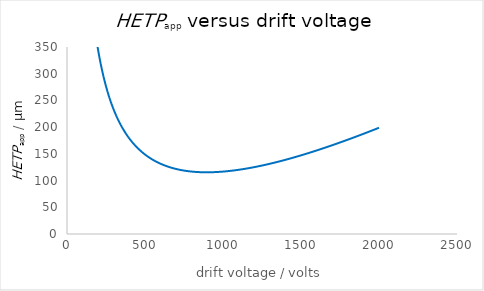
| Category | Series 0 |
|---|---|
| 1.0 | 61631.686 |
| 2.0 | 31091.12 |
| 3.0 | 20854.214 |
| 4.0 | 15715.368 |
| 5.0 | 12622.148 |
| 6.0 | 10554.353 |
| 7.0 | 9073.799 |
| 8.0 | 7960.981 |
| 9.0 | 7093.749 |
| 10.0 | 6398.702 |
| 11.0 | 5829.066 |
| 12.0 | 5353.618 |
| 13.0 | 4950.715 |
| 14.0 | 4604.882 |
| 15.0 | 4304.758 |
| 16.0 | 4041.814 |
| 17.0 | 3809.52 |
| 18.0 | 3602.794 |
| 19.0 | 3417.62 |
| 20.0 | 3250.782 |
| 21.0 | 3099.675 |
| 22.0 | 2962.166 |
| 23.0 | 2836.49 |
| 24.0 | 2721.178 |
| 25.0 | 2614.992 |
| 26.0 | 2516.886 |
| 27.0 | 2425.968 |
| 28.0 | 2341.472 |
| 29.0 | 2262.738 |
| 30.0 | 2189.193 |
| 31.0 | 2120.339 |
| 32.0 | 2055.738 |
| 33.0 | 1995.006 |
| 34.0 | 1937.804 |
| 35.0 | 1883.832 |
| 36.0 | 1832.823 |
| 37.0 | 1784.537 |
| 38.0 | 1738.761 |
| 39.0 | 1695.303 |
| 40.0 | 1653.991 |
| 41.0 | 1614.669 |
| 42.0 | 1577.196 |
| 43.0 | 1541.444 |
| 44.0 | 1507.296 |
| 45.0 | 1474.645 |
| 46.0 | 1443.396 |
| 47.0 | 1413.46 |
| 48.0 | 1384.754 |
| 49.0 | 1357.204 |
| 50.0 | 1330.742 |
| 51.0 | 1305.304 |
| 52.0 | 1280.83 |
| 53.0 | 1257.268 |
| 54.0 | 1234.567 |
| 55.0 | 1212.68 |
| 56.0 | 1191.564 |
| 57.0 | 1171.178 |
| 58.0 | 1151.486 |
| 59.0 | 1132.452 |
| 60.0 | 1114.044 |
| 61.0 | 1096.231 |
| 62.0 | 1078.984 |
| 63.0 | 1062.278 |
| 64.0 | 1046.086 |
| 65.0 | 1030.385 |
| 66.0 | 1015.153 |
| 67.0 | 1000.37 |
| 68.0 | 986.015 |
| 69.0 | 972.07 |
| 70.0 | 958.518 |
| 71.0 | 945.342 |
| 72.0 | 932.527 |
| 73.0 | 920.058 |
| 74.0 | 907.922 |
| 75.0 | 896.104 |
| 76.0 | 884.593 |
| 77.0 | 873.376 |
| 78.0 | 862.443 |
| 79.0 | 851.783 |
| 80.0 | 841.385 |
| 81.0 | 831.24 |
| 82.0 | 821.34 |
| 83.0 | 811.674 |
| 84.0 | 802.235 |
| 85.0 | 793.015 |
| 86.0 | 784.007 |
| 87.0 | 775.202 |
| 88.0 | 766.595 |
| 89.0 | 758.178 |
| 90.0 | 749.946 |
| 91.0 | 741.892 |
| 92.0 | 734.01 |
| 93.0 | 726.296 |
| 94.0 | 718.743 |
| 95.0 | 711.347 |
| 96.0 | 704.103 |
| 97.0 | 697.007 |
| 98.0 | 690.053 |
| 99.0 | 683.237 |
| 100.0 | 676.556 |
| 101.0 | 670.005 |
| 102.0 | 663.581 |
| 103.0 | 657.28 |
| 104.0 | 651.099 |
| 105.0 | 645.033 |
| 106.0 | 639.081 |
| 107.0 | 633.238 |
| 108.0 | 627.501 |
| 109.0 | 621.869 |
| 110.0 | 616.338 |
| 111.0 | 610.905 |
| 112.0 | 605.567 |
| 113.0 | 600.323 |
| 114.0 | 595.17 |
| 115.0 | 590.105 |
| 116.0 | 585.126 |
| 117.0 | 580.231 |
| 118.0 | 575.418 |
| 119.0 | 570.685 |
| 120.0 | 566.03 |
| 121.0 | 561.45 |
| 122.0 | 556.945 |
| 123.0 | 552.512 |
| 124.0 | 548.15 |
| 125.0 | 543.857 |
| 126.0 | 539.631 |
| 127.0 | 535.47 |
| 128.0 | 531.374 |
| 129.0 | 527.341 |
| 130.0 | 523.369 |
| 131.0 | 519.457 |
| 132.0 | 515.603 |
| 133.0 | 511.807 |
| 134.0 | 508.066 |
| 135.0 | 504.381 |
| 136.0 | 500.749 |
| 137.0 | 497.169 |
| 138.0 | 493.641 |
| 139.0 | 490.163 |
| 140.0 | 486.734 |
| 141.0 | 483.353 |
| 142.0 | 480.02 |
| 143.0 | 476.732 |
| 144.0 | 473.49 |
| 145.0 | 470.292 |
| 146.0 | 467.137 |
| 147.0 | 464.025 |
| 148.0 | 460.954 |
| 149.0 | 457.925 |
| 150.0 | 454.935 |
| 151.0 | 451.984 |
| 152.0 | 449.072 |
| 153.0 | 446.198 |
| 154.0 | 443.361 |
| 155.0 | 440.56 |
| 156.0 | 437.794 |
| 157.0 | 435.064 |
| 158.0 | 432.368 |
| 159.0 | 429.705 |
| 160.0 | 427.076 |
| 161.0 | 424.479 |
| 162.0 | 421.913 |
| 163.0 | 419.379 |
| 164.0 | 416.876 |
| 165.0 | 414.403 |
| 166.0 | 411.959 |
| 167.0 | 409.545 |
| 168.0 | 407.159 |
| 169.0 | 404.801 |
| 170.0 | 402.471 |
| 171.0 | 400.168 |
| 172.0 | 397.891 |
| 173.0 | 395.641 |
| 174.0 | 393.416 |
| 175.0 | 391.217 |
| 176.0 | 389.042 |
| 177.0 | 386.892 |
| 178.0 | 384.766 |
| 179.0 | 382.664 |
| 180.0 | 380.585 |
| 181.0 | 378.529 |
| 182.0 | 376.496 |
| 183.0 | 374.484 |
| 184.0 | 372.495 |
| 185.0 | 370.527 |
| 186.0 | 368.58 |
| 187.0 | 366.653 |
| 188.0 | 364.748 |
| 189.0 | 362.862 |
| 190.0 | 360.996 |
| 191.0 | 359.15 |
| 192.0 | 357.323 |
| 193.0 | 355.515 |
| 194.0 | 353.726 |
| 195.0 | 351.955 |
| 196.0 | 350.202 |
| 197.0 | 348.466 |
| 198.0 | 346.749 |
| 199.0 | 345.048 |
| 200.0 | 343.365 |
| 201.0 | 341.699 |
| 202.0 | 340.049 |
| 203.0 | 338.415 |
| 204.0 | 336.797 |
| 205.0 | 335.196 |
| 206.0 | 333.61 |
| 207.0 | 332.039 |
| 208.0 | 330.483 |
| 209.0 | 328.943 |
| 210.0 | 327.417 |
| 211.0 | 325.906 |
| 212.0 | 324.409 |
| 213.0 | 322.926 |
| 214.0 | 321.457 |
| 215.0 | 320.002 |
| 216.0 | 318.56 |
| 217.0 | 317.132 |
| 218.0 | 315.717 |
| 219.0 | 314.315 |
| 220.0 | 312.926 |
| 221.0 | 311.55 |
| 222.0 | 310.186 |
| 223.0 | 308.834 |
| 224.0 | 307.495 |
| 225.0 | 306.168 |
| 226.0 | 304.852 |
| 227.0 | 303.549 |
| 228.0 | 302.257 |
| 229.0 | 300.976 |
| 230.0 | 299.707 |
| 231.0 | 298.448 |
| 232.0 | 297.201 |
| 233.0 | 295.965 |
| 234.0 | 294.739 |
| 235.0 | 293.524 |
| 236.0 | 292.319 |
| 237.0 | 291.125 |
| 238.0 | 289.941 |
| 239.0 | 288.767 |
| 240.0 | 287.602 |
| 241.0 | 286.448 |
| 242.0 | 285.304 |
| 243.0 | 284.169 |
| 244.0 | 283.043 |
| 245.0 | 281.927 |
| 246.0 | 280.82 |
| 247.0 | 279.722 |
| 248.0 | 278.634 |
| 249.0 | 277.554 |
| 250.0 | 276.483 |
| 251.0 | 275.421 |
| 252.0 | 274.367 |
| 253.0 | 273.322 |
| 254.0 | 272.286 |
| 255.0 | 271.257 |
| 256.0 | 270.237 |
| 257.0 | 269.225 |
| 258.0 | 268.221 |
| 259.0 | 267.225 |
| 260.0 | 266.237 |
| 261.0 | 265.257 |
| 262.0 | 264.285 |
| 263.0 | 263.32 |
| 264.0 | 262.362 |
| 265.0 | 261.412 |
| 266.0 | 260.469 |
| 267.0 | 259.534 |
| 268.0 | 258.606 |
| 269.0 | 257.685 |
| 270.0 | 256.771 |
| 271.0 | 255.864 |
| 272.0 | 254.964 |
| 273.0 | 254.07 |
| 274.0 | 253.184 |
| 275.0 | 252.304 |
| 276.0 | 251.43 |
| 277.0 | 250.564 |
| 278.0 | 249.703 |
| 279.0 | 248.849 |
| 280.0 | 248.002 |
| 281.0 | 247.161 |
| 282.0 | 246.325 |
| 283.0 | 245.496 |
| 284.0 | 244.674 |
| 285.0 | 243.857 |
| 286.0 | 243.046 |
| 287.0 | 242.241 |
| 288.0 | 241.442 |
| 289.0 | 240.648 |
| 290.0 | 239.86 |
| 291.0 | 239.078 |
| 292.0 | 238.302 |
| 293.0 | 237.531 |
| 294.0 | 236.766 |
| 295.0 | 236.006 |
| 296.0 | 235.251 |
| 297.0 | 234.502 |
| 298.0 | 233.758 |
| 299.0 | 233.019 |
| 300.0 | 232.286 |
| 301.0 | 231.557 |
| 302.0 | 230.834 |
| 303.0 | 230.116 |
| 304.0 | 229.402 |
| 305.0 | 228.694 |
| 306.0 | 227.991 |
| 307.0 | 227.292 |
| 308.0 | 226.598 |
| 309.0 | 225.909 |
| 310.0 | 225.225 |
| 311.0 | 224.545 |
| 312.0 | 223.87 |
| 313.0 | 223.199 |
| 314.0 | 222.533 |
| 315.0 | 221.872 |
| 316.0 | 221.215 |
| 317.0 | 220.562 |
| 318.0 | 219.914 |
| 319.0 | 219.27 |
| 320.0 | 218.631 |
| 321.0 | 217.995 |
| 322.0 | 217.364 |
| 323.0 | 216.737 |
| 324.0 | 216.114 |
| 325.0 | 215.496 |
| 326.0 | 214.881 |
| 327.0 | 214.27 |
| 328.0 | 213.664 |
| 329.0 | 213.061 |
| 330.0 | 212.462 |
| 331.0 | 211.868 |
| 332.0 | 211.277 |
| 333.0 | 210.689 |
| 334.0 | 210.106 |
| 335.0 | 209.527 |
| 336.0 | 208.951 |
| 337.0 | 208.379 |
| 338.0 | 207.81 |
| 339.0 | 207.245 |
| 340.0 | 206.684 |
| 341.0 | 206.126 |
| 342.0 | 205.572 |
| 343.0 | 205.022 |
| 344.0 | 204.474 |
| 345.0 | 203.931 |
| 346.0 | 203.391 |
| 347.0 | 202.854 |
| 348.0 | 202.32 |
| 349.0 | 201.79 |
| 350.0 | 201.263 |
| 351.0 | 200.74 |
| 352.0 | 200.219 |
| 353.0 | 199.702 |
| 354.0 | 199.189 |
| 355.0 | 198.678 |
| 356.0 | 198.171 |
| 357.0 | 197.666 |
| 358.0 | 197.165 |
| 359.0 | 196.667 |
| 360.0 | 196.172 |
| 361.0 | 195.68 |
| 362.0 | 195.191 |
| 363.0 | 194.704 |
| 364.0 | 194.221 |
| 365.0 | 193.741 |
| 366.0 | 193.264 |
| 367.0 | 192.79 |
| 368.0 | 192.318 |
| 369.0 | 191.849 |
| 370.0 | 191.384 |
| 371.0 | 190.921 |
| 372.0 | 190.46 |
| 373.0 | 190.003 |
| 374.0 | 189.548 |
| 375.0 | 189.096 |
| 376.0 | 188.647 |
| 377.0 | 188.2 |
| 378.0 | 187.756 |
| 379.0 | 187.315 |
| 380.0 | 186.876 |
| 381.0 | 186.44 |
| 382.0 | 186.006 |
| 383.0 | 185.575 |
| 384.0 | 185.147 |
| 385.0 | 184.721 |
| 386.0 | 184.298 |
| 387.0 | 183.877 |
| 388.0 | 183.458 |
| 389.0 | 183.042 |
| 390.0 | 182.629 |
| 391.0 | 182.218 |
| 392.0 | 181.809 |
| 393.0 | 181.402 |
| 394.0 | 180.998 |
| 395.0 | 180.597 |
| 396.0 | 180.197 |
| 397.0 | 179.8 |
| 398.0 | 179.406 |
| 399.0 | 179.013 |
| 400.0 | 178.623 |
| 401.0 | 178.235 |
| 402.0 | 177.849 |
| 403.0 | 177.466 |
| 404.0 | 177.084 |
| 405.0 | 176.705 |
| 406.0 | 176.328 |
| 407.0 | 175.953 |
| 408.0 | 175.581 |
| 409.0 | 175.21 |
| 410.0 | 174.842 |
| 411.0 | 174.475 |
| 412.0 | 174.111 |
| 413.0 | 173.749 |
| 414.0 | 173.389 |
| 415.0 | 173.031 |
| 416.0 | 172.675 |
| 417.0 | 172.321 |
| 418.0 | 171.969 |
| 419.0 | 171.618 |
| 420.0 | 171.27 |
| 421.0 | 170.924 |
| 422.0 | 170.58 |
| 423.0 | 170.238 |
| 424.0 | 169.897 |
| 425.0 | 169.559 |
| 426.0 | 169.222 |
| 427.0 | 168.888 |
| 428.0 | 168.555 |
| 429.0 | 168.224 |
| 430.0 | 167.895 |
| 431.0 | 167.567 |
| 432.0 | 167.242 |
| 433.0 | 166.918 |
| 434.0 | 166.596 |
| 435.0 | 166.276 |
| 436.0 | 165.958 |
| 437.0 | 165.641 |
| 438.0 | 165.326 |
| 439.0 | 165.013 |
| 440.0 | 164.702 |
| 441.0 | 164.392 |
| 442.0 | 164.085 |
| 443.0 | 163.778 |
| 444.0 | 163.474 |
| 445.0 | 163.171 |
| 446.0 | 162.87 |
| 447.0 | 162.57 |
| 448.0 | 162.272 |
| 449.0 | 161.976 |
| 450.0 | 161.681 |
| 451.0 | 161.388 |
| 452.0 | 161.097 |
| 453.0 | 160.807 |
| 454.0 | 160.519 |
| 455.0 | 160.232 |
| 456.0 | 159.947 |
| 457.0 | 159.663 |
| 458.0 | 159.381 |
| 459.0 | 159.101 |
| 460.0 | 158.822 |
| 461.0 | 158.544 |
| 462.0 | 158.268 |
| 463.0 | 157.994 |
| 464.0 | 157.721 |
| 465.0 | 157.45 |
| 466.0 | 157.18 |
| 467.0 | 156.911 |
| 468.0 | 156.644 |
| 469.0 | 156.378 |
| 470.0 | 156.114 |
| 471.0 | 155.851 |
| 472.0 | 155.59 |
| 473.0 | 155.33 |
| 474.0 | 155.071 |
| 475.0 | 154.814 |
| 476.0 | 154.558 |
| 477.0 | 154.304 |
| 478.0 | 154.051 |
| 479.0 | 153.799 |
| 480.0 | 153.549 |
| 481.0 | 153.3 |
| 482.0 | 153.052 |
| 483.0 | 152.806 |
| 484.0 | 152.561 |
| 485.0 | 152.317 |
| 486.0 | 152.075 |
| 487.0 | 151.834 |
| 488.0 | 151.594 |
| 489.0 | 151.356 |
| 490.0 | 151.119 |
| 491.0 | 150.883 |
| 492.0 | 150.648 |
| 493.0 | 150.415 |
| 494.0 | 150.183 |
| 495.0 | 149.952 |
| 496.0 | 149.722 |
| 497.0 | 149.494 |
| 498.0 | 149.266 |
| 499.0 | 149.04 |
| 500.0 | 148.816 |
| 501.0 | 148.592 |
| 502.0 | 148.37 |
| 503.0 | 148.149 |
| 504.0 | 147.929 |
| 505.0 | 147.71 |
| 506.0 | 147.492 |
| 507.0 | 147.276 |
| 508.0 | 147.06 |
| 509.0 | 146.846 |
| 510.0 | 146.633 |
| 511.0 | 146.421 |
| 512.0 | 146.21 |
| 513.0 | 146.001 |
| 514.0 | 145.792 |
| 515.0 | 145.585 |
| 516.0 | 145.378 |
| 517.0 | 145.173 |
| 518.0 | 144.969 |
| 519.0 | 144.766 |
| 520.0 | 144.564 |
| 521.0 | 144.363 |
| 522.0 | 144.164 |
| 523.0 | 143.965 |
| 524.0 | 143.767 |
| 525.0 | 143.571 |
| 526.0 | 143.375 |
| 527.0 | 143.181 |
| 528.0 | 142.987 |
| 529.0 | 142.795 |
| 530.0 | 142.603 |
| 531.0 | 142.413 |
| 532.0 | 142.224 |
| 533.0 | 142.035 |
| 534.0 | 141.848 |
| 535.0 | 141.662 |
| 536.0 | 141.477 |
| 537.0 | 141.292 |
| 538.0 | 141.109 |
| 539.0 | 140.927 |
| 540.0 | 140.745 |
| 541.0 | 140.565 |
| 542.0 | 140.385 |
| 543.0 | 140.207 |
| 544.0 | 140.029 |
| 545.0 | 139.853 |
| 546.0 | 139.677 |
| 547.0 | 139.503 |
| 548.0 | 139.329 |
| 549.0 | 139.156 |
| 550.0 | 138.984 |
| 551.0 | 138.814 |
| 552.0 | 138.644 |
| 553.0 | 138.475 |
| 554.0 | 138.306 |
| 555.0 | 138.139 |
| 556.0 | 137.973 |
| 557.0 | 137.807 |
| 558.0 | 137.643 |
| 559.0 | 137.479 |
| 560.0 | 137.316 |
| 561.0 | 137.155 |
| 562.0 | 136.994 |
| 563.0 | 136.833 |
| 564.0 | 136.674 |
| 565.0 | 136.516 |
| 566.0 | 136.358 |
| 567.0 | 136.202 |
| 568.0 | 136.046 |
| 569.0 | 135.891 |
| 570.0 | 135.737 |
| 571.0 | 135.583 |
| 572.0 | 135.431 |
| 573.0 | 135.279 |
| 574.0 | 135.128 |
| 575.0 | 134.979 |
| 576.0 | 134.829 |
| 577.0 | 134.681 |
| 578.0 | 134.534 |
| 579.0 | 134.387 |
| 580.0 | 134.241 |
| 581.0 | 134.096 |
| 582.0 | 133.952 |
| 583.0 | 133.808 |
| 584.0 | 133.665 |
| 585.0 | 133.524 |
| 586.0 | 133.382 |
| 587.0 | 133.242 |
| 588.0 | 133.102 |
| 589.0 | 132.964 |
| 590.0 | 132.826 |
| 591.0 | 132.688 |
| 592.0 | 132.552 |
| 593.0 | 132.416 |
| 594.0 | 132.281 |
| 595.0 | 132.147 |
| 596.0 | 132.014 |
| 597.0 | 131.881 |
| 598.0 | 131.749 |
| 599.0 | 131.618 |
| 600.0 | 131.487 |
| 601.0 | 131.357 |
| 602.0 | 131.228 |
| 603.0 | 131.1 |
| 604.0 | 130.972 |
| 605.0 | 130.845 |
| 606.0 | 130.719 |
| 607.0 | 130.594 |
| 608.0 | 130.469 |
| 609.0 | 130.345 |
| 610.0 | 130.222 |
| 611.0 | 130.099 |
| 612.0 | 129.977 |
| 613.0 | 129.856 |
| 614.0 | 129.735 |
| 615.0 | 129.616 |
| 616.0 | 129.496 |
| 617.0 | 129.378 |
| 618.0 | 129.26 |
| 619.0 | 129.143 |
| 620.0 | 129.027 |
| 621.0 | 128.911 |
| 622.0 | 128.796 |
| 623.0 | 128.681 |
| 624.0 | 128.568 |
| 625.0 | 128.454 |
| 626.0 | 128.342 |
| 627.0 | 128.23 |
| 628.0 | 128.119 |
| 629.0 | 128.009 |
| 630.0 | 127.899 |
| 631.0 | 127.79 |
| 632.0 | 127.681 |
| 633.0 | 127.573 |
| 634.0 | 127.466 |
| 635.0 | 127.359 |
| 636.0 | 127.253 |
| 637.0 | 127.148 |
| 638.0 | 127.043 |
| 639.0 | 126.939 |
| 640.0 | 126.835 |
| 641.0 | 126.732 |
| 642.0 | 126.63 |
| 643.0 | 126.528 |
| 644.0 | 126.427 |
| 645.0 | 126.327 |
| 646.0 | 126.227 |
| 647.0 | 126.128 |
| 648.0 | 126.029 |
| 649.0 | 125.931 |
| 650.0 | 125.834 |
| 651.0 | 125.737 |
| 652.0 | 125.64 |
| 653.0 | 125.545 |
| 654.0 | 125.45 |
| 655.0 | 125.355 |
| 656.0 | 125.261 |
| 657.0 | 125.168 |
| 658.0 | 125.075 |
| 659.0 | 124.983 |
| 660.0 | 124.891 |
| 661.0 | 124.8 |
| 662.0 | 124.71 |
| 663.0 | 124.62 |
| 664.0 | 124.53 |
| 665.0 | 124.441 |
| 666.0 | 124.353 |
| 667.0 | 124.266 |
| 668.0 | 124.178 |
| 669.0 | 124.092 |
| 670.0 | 124.006 |
| 671.0 | 123.92 |
| 672.0 | 123.835 |
| 673.0 | 123.751 |
| 674.0 | 123.667 |
| 675.0 | 123.584 |
| 676.0 | 123.501 |
| 677.0 | 123.419 |
| 678.0 | 123.337 |
| 679.0 | 123.256 |
| 680.0 | 123.175 |
| 681.0 | 123.095 |
| 682.0 | 123.015 |
| 683.0 | 122.936 |
| 684.0 | 122.858 |
| 685.0 | 122.78 |
| 686.0 | 122.702 |
| 687.0 | 122.625 |
| 688.0 | 122.549 |
| 689.0 | 122.473 |
| 690.0 | 122.397 |
| 691.0 | 122.322 |
| 692.0 | 122.248 |
| 693.0 | 122.174 |
| 694.0 | 122.1 |
| 695.0 | 122.028 |
| 696.0 | 121.955 |
| 697.0 | 121.883 |
| 698.0 | 121.812 |
| 699.0 | 121.741 |
| 700.0 | 121.67 |
| 701.0 | 121.6 |
| 702.0 | 121.531 |
| 703.0 | 121.462 |
| 704.0 | 121.393 |
| 705.0 | 121.325 |
| 706.0 | 121.257 |
| 707.0 | 121.19 |
| 708.0 | 121.124 |
| 709.0 | 121.058 |
| 710.0 | 120.992 |
| 711.0 | 120.927 |
| 712.0 | 120.862 |
| 713.0 | 120.798 |
| 714.0 | 120.734 |
| 715.0 | 120.671 |
| 716.0 | 120.608 |
| 717.0 | 120.545 |
| 718.0 | 120.483 |
| 719.0 | 120.422 |
| 720.0 | 120.361 |
| 721.0 | 120.3 |
| 722.0 | 120.24 |
| 723.0 | 120.181 |
| 724.0 | 120.121 |
| 725.0 | 120.063 |
| 726.0 | 120.004 |
| 727.0 | 119.946 |
| 728.0 | 119.889 |
| 729.0 | 119.832 |
| 730.0 | 119.775 |
| 731.0 | 119.719 |
| 732.0 | 119.664 |
| 733.0 | 119.608 |
| 734.0 | 119.553 |
| 735.0 | 119.499 |
| 736.0 | 119.445 |
| 737.0 | 119.392 |
| 738.0 | 119.339 |
| 739.0 | 119.286 |
| 740.0 | 119.234 |
| 741.0 | 119.182 |
| 742.0 | 119.13 |
| 743.0 | 119.08 |
| 744.0 | 119.029 |
| 745.0 | 118.979 |
| 746.0 | 118.929 |
| 747.0 | 118.88 |
| 748.0 | 118.831 |
| 749.0 | 118.782 |
| 750.0 | 118.734 |
| 751.0 | 118.687 |
| 752.0 | 118.64 |
| 753.0 | 118.593 |
| 754.0 | 118.546 |
| 755.0 | 118.5 |
| 756.0 | 118.455 |
| 757.0 | 118.409 |
| 758.0 | 118.365 |
| 759.0 | 118.32 |
| 760.0 | 118.276 |
| 761.0 | 118.233 |
| 762.0 | 118.189 |
| 763.0 | 118.146 |
| 764.0 | 118.104 |
| 765.0 | 118.062 |
| 766.0 | 118.02 |
| 767.0 | 117.979 |
| 768.0 | 117.938 |
| 769.0 | 117.898 |
| 770.0 | 117.857 |
| 771.0 | 117.818 |
| 772.0 | 117.778 |
| 773.0 | 117.739 |
| 774.0 | 117.701 |
| 775.0 | 117.663 |
| 776.0 | 117.625 |
| 777.0 | 117.587 |
| 778.0 | 117.55 |
| 779.0 | 117.514 |
| 780.0 | 117.477 |
| 781.0 | 117.441 |
| 782.0 | 117.406 |
| 783.0 | 117.37 |
| 784.0 | 117.336 |
| 785.0 | 117.301 |
| 786.0 | 117.267 |
| 787.0 | 117.233 |
| 788.0 | 117.2 |
| 789.0 | 117.167 |
| 790.0 | 117.134 |
| 791.0 | 117.102 |
| 792.0 | 117.07 |
| 793.0 | 117.038 |
| 794.0 | 117.007 |
| 795.0 | 116.976 |
| 796.0 | 116.945 |
| 797.0 | 116.915 |
| 798.0 | 116.885 |
| 799.0 | 116.856 |
| 800.0 | 116.827 |
| 801.0 | 116.798 |
| 802.0 | 116.77 |
| 803.0 | 116.741 |
| 804.0 | 116.714 |
| 805.0 | 116.686 |
| 806.0 | 116.659 |
| 807.0 | 116.632 |
| 808.0 | 116.606 |
| 809.0 | 116.58 |
| 810.0 | 116.554 |
| 811.0 | 116.529 |
| 812.0 | 116.504 |
| 813.0 | 116.479 |
| 814.0 | 116.455 |
| 815.0 | 116.431 |
| 816.0 | 116.407 |
| 817.0 | 116.384 |
| 818.0 | 116.361 |
| 819.0 | 116.338 |
| 820.0 | 116.316 |
| 821.0 | 116.294 |
| 822.0 | 116.272 |
| 823.0 | 116.251 |
| 824.0 | 116.229 |
| 825.0 | 116.209 |
| 826.0 | 116.188 |
| 827.0 | 116.168 |
| 828.0 | 116.148 |
| 829.0 | 116.129 |
| 830.0 | 116.11 |
| 831.0 | 116.091 |
| 832.0 | 116.072 |
| 833.0 | 116.054 |
| 834.0 | 116.036 |
| 835.0 | 116.019 |
| 836.0 | 116.002 |
| 837.0 | 115.985 |
| 838.0 | 115.968 |
| 839.0 | 115.952 |
| 840.0 | 115.936 |
| 841.0 | 115.92 |
| 842.0 | 115.905 |
| 843.0 | 115.89 |
| 844.0 | 115.875 |
| 845.0 | 115.86 |
| 846.0 | 115.846 |
| 847.0 | 115.832 |
| 848.0 | 115.819 |
| 849.0 | 115.805 |
| 850.0 | 115.792 |
| 851.0 | 115.78 |
| 852.0 | 115.767 |
| 853.0 | 115.755 |
| 854.0 | 115.744 |
| 855.0 | 115.732 |
| 856.0 | 115.721 |
| 857.0 | 115.71 |
| 858.0 | 115.699 |
| 859.0 | 115.689 |
| 860.0 | 115.679 |
| 861.0 | 115.669 |
| 862.0 | 115.66 |
| 863.0 | 115.651 |
| 864.0 | 115.642 |
| 865.0 | 115.633 |
| 866.0 | 115.625 |
| 867.0 | 115.617 |
| 868.0 | 115.61 |
| 869.0 | 115.602 |
| 870.0 | 115.595 |
| 871.0 | 115.588 |
| 872.0 | 115.582 |
| 873.0 | 115.575 |
| 874.0 | 115.569 |
| 875.0 | 115.564 |
| 876.0 | 115.558 |
| 877.0 | 115.553 |
| 878.0 | 115.548 |
| 879.0 | 115.543 |
| 880.0 | 115.539 |
| 881.0 | 115.535 |
| 882.0 | 115.531 |
| 883.0 | 115.528 |
| 884.0 | 115.524 |
| 885.0 | 115.522 |
| 886.0 | 115.519 |
| 887.0 | 115.516 |
| 888.0 | 115.514 |
| 889.0 | 115.512 |
| 890.0 | 115.511 |
| 891.0 | 115.509 |
| 892.0 | 115.508 |
| 893.0 | 115.507 |
| 894.0 | 115.507 |
| 895.0 | 115.507 |
| 896.0 | 115.507 |
| 897.0 | 115.507 |
| 898.0 | 115.507 |
| 899.0 | 115.508 |
| 900.0 | 115.509 |
| 901.0 | 115.51 |
| 902.0 | 115.512 |
| 903.0 | 115.514 |
| 904.0 | 115.516 |
| 905.0 | 115.518 |
| 906.0 | 115.521 |
| 907.0 | 115.524 |
| 908.0 | 115.527 |
| 909.0 | 115.53 |
| 910.0 | 115.534 |
| 911.0 | 115.537 |
| 912.0 | 115.542 |
| 913.0 | 115.546 |
| 914.0 | 115.551 |
| 915.0 | 115.555 |
| 916.0 | 115.561 |
| 917.0 | 115.566 |
| 918.0 | 115.572 |
| 919.0 | 115.577 |
| 920.0 | 115.583 |
| 921.0 | 115.59 |
| 922.0 | 115.596 |
| 923.0 | 115.603 |
| 924.0 | 115.61 |
| 925.0 | 115.618 |
| 926.0 | 115.625 |
| 927.0 | 115.633 |
| 928.0 | 115.641 |
| 929.0 | 115.649 |
| 930.0 | 115.658 |
| 931.0 | 115.667 |
| 932.0 | 115.676 |
| 933.0 | 115.685 |
| 934.0 | 115.695 |
| 935.0 | 115.704 |
| 936.0 | 115.714 |
| 937.0 | 115.725 |
| 938.0 | 115.735 |
| 939.0 | 115.746 |
| 940.0 | 115.757 |
| 941.0 | 115.768 |
| 942.0 | 115.779 |
| 943.0 | 115.791 |
| 944.0 | 115.803 |
| 945.0 | 115.815 |
| 946.0 | 115.827 |
| 947.0 | 115.84 |
| 948.0 | 115.852 |
| 949.0 | 115.865 |
| 950.0 | 115.879 |
| 951.0 | 115.892 |
| 952.0 | 115.906 |
| 953.0 | 115.92 |
| 954.0 | 115.934 |
| 955.0 | 115.948 |
| 956.0 | 115.963 |
| 957.0 | 115.978 |
| 958.0 | 115.993 |
| 959.0 | 116.008 |
| 960.0 | 116.024 |
| 961.0 | 116.039 |
| 962.0 | 116.055 |
| 963.0 | 116.072 |
| 964.0 | 116.088 |
| 965.0 | 116.105 |
| 966.0 | 116.121 |
| 967.0 | 116.138 |
| 968.0 | 116.156 |
| 969.0 | 116.173 |
| 970.0 | 116.191 |
| 971.0 | 116.209 |
| 972.0 | 116.227 |
| 973.0 | 116.245 |
| 974.0 | 116.264 |
| 975.0 | 116.283 |
| 976.0 | 116.302 |
| 977.0 | 116.321 |
| 978.0 | 116.34 |
| 979.0 | 116.36 |
| 980.0 | 116.38 |
| 981.0 | 116.4 |
| 982.0 | 116.42 |
| 983.0 | 116.441 |
| 984.0 | 116.462 |
| 985.0 | 116.482 |
| 986.0 | 116.504 |
| 987.0 | 116.525 |
| 988.0 | 116.546 |
| 989.0 | 116.568 |
| 990.0 | 116.59 |
| 991.0 | 116.612 |
| 992.0 | 116.635 |
| 993.0 | 116.657 |
| 994.0 | 116.68 |
| 995.0 | 116.703 |
| 996.0 | 116.726 |
| 997.0 | 116.75 |
| 998.0 | 116.773 |
| 999.0 | 116.797 |
| 1000.0 | 116.821 |
| 1001.0 | 116.845 |
| 1002.0 | 116.87 |
| 1003.0 | 116.894 |
| 1004.0 | 116.919 |
| 1005.0 | 116.944 |
| 1006.0 | 116.969 |
| 1007.0 | 116.995 |
| 1008.0 | 117.021 |
| 1009.0 | 117.046 |
| 1010.0 | 117.072 |
| 1011.0 | 117.099 |
| 1012.0 | 117.125 |
| 1013.0 | 117.152 |
| 1014.0 | 117.178 |
| 1015.0 | 117.205 |
| 1016.0 | 117.233 |
| 1017.0 | 117.26 |
| 1018.0 | 117.288 |
| 1019.0 | 117.315 |
| 1020.0 | 117.343 |
| 1021.0 | 117.372 |
| 1022.0 | 117.4 |
| 1023.0 | 117.428 |
| 1024.0 | 117.457 |
| 1025.0 | 117.486 |
| 1026.0 | 117.515 |
| 1027.0 | 117.545 |
| 1028.0 | 117.574 |
| 1029.0 | 117.604 |
| 1030.0 | 117.634 |
| 1031.0 | 117.664 |
| 1032.0 | 117.694 |
| 1033.0 | 117.724 |
| 1034.0 | 117.755 |
| 1035.0 | 117.786 |
| 1036.0 | 117.817 |
| 1037.0 | 117.848 |
| 1038.0 | 117.879 |
| 1039.0 | 117.911 |
| 1040.0 | 117.943 |
| 1041.0 | 117.975 |
| 1042.0 | 118.007 |
| 1043.0 | 118.039 |
| 1044.0 | 118.072 |
| 1045.0 | 118.104 |
| 1046.0 | 118.137 |
| 1047.0 | 118.17 |
| 1048.0 | 118.203 |
| 1049.0 | 118.237 |
| 1050.0 | 118.27 |
| 1051.0 | 118.304 |
| 1052.0 | 118.338 |
| 1053.0 | 118.372 |
| 1054.0 | 118.407 |
| 1055.0 | 118.441 |
| 1056.0 | 118.476 |
| 1057.0 | 118.51 |
| 1058.0 | 118.545 |
| 1059.0 | 118.581 |
| 1060.0 | 118.616 |
| 1061.0 | 118.652 |
| 1062.0 | 118.687 |
| 1063.0 | 118.723 |
| 1064.0 | 118.759 |
| 1065.0 | 118.795 |
| 1066.0 | 118.832 |
| 1067.0 | 118.868 |
| 1068.0 | 118.905 |
| 1069.0 | 118.942 |
| 1070.0 | 118.979 |
| 1071.0 | 119.017 |
| 1072.0 | 119.054 |
| 1073.0 | 119.092 |
| 1074.0 | 119.129 |
| 1075.0 | 119.167 |
| 1076.0 | 119.206 |
| 1077.0 | 119.244 |
| 1078.0 | 119.282 |
| 1079.0 | 119.321 |
| 1080.0 | 119.36 |
| 1081.0 | 119.399 |
| 1082.0 | 119.438 |
| 1083.0 | 119.477 |
| 1084.0 | 119.517 |
| 1085.0 | 119.556 |
| 1086.0 | 119.596 |
| 1087.0 | 119.636 |
| 1088.0 | 119.676 |
| 1089.0 | 119.717 |
| 1090.0 | 119.757 |
| 1091.0 | 119.798 |
| 1092.0 | 119.839 |
| 1093.0 | 119.88 |
| 1094.0 | 119.921 |
| 1095.0 | 119.962 |
| 1096.0 | 120.004 |
| 1097.0 | 120.045 |
| 1098.0 | 120.087 |
| 1099.0 | 120.129 |
| 1100.0 | 120.171 |
| 1101.0 | 120.214 |
| 1102.0 | 120.256 |
| 1103.0 | 120.299 |
| 1104.0 | 120.341 |
| 1105.0 | 120.384 |
| 1106.0 | 120.427 |
| 1107.0 | 120.471 |
| 1108.0 | 120.514 |
| 1109.0 | 120.558 |
| 1110.0 | 120.601 |
| 1111.0 | 120.645 |
| 1112.0 | 120.689 |
| 1113.0 | 120.734 |
| 1114.0 | 120.778 |
| 1115.0 | 120.822 |
| 1116.0 | 120.867 |
| 1117.0 | 120.912 |
| 1118.0 | 120.957 |
| 1119.0 | 121.002 |
| 1120.0 | 121.047 |
| 1121.0 | 121.093 |
| 1122.0 | 121.138 |
| 1123.0 | 121.184 |
| 1124.0 | 121.23 |
| 1125.0 | 121.276 |
| 1126.0 | 121.322 |
| 1127.0 | 121.369 |
| 1128.0 | 121.415 |
| 1129.0 | 121.462 |
| 1130.0 | 121.509 |
| 1131.0 | 121.556 |
| 1132.0 | 121.603 |
| 1133.0 | 121.65 |
| 1134.0 | 121.698 |
| 1135.0 | 121.745 |
| 1136.0 | 121.793 |
| 1137.0 | 121.841 |
| 1138.0 | 121.889 |
| 1139.0 | 121.937 |
| 1140.0 | 121.986 |
| 1141.0 | 122.034 |
| 1142.0 | 122.083 |
| 1143.0 | 122.131 |
| 1144.0 | 122.18 |
| 1145.0 | 122.229 |
| 1146.0 | 122.279 |
| 1147.0 | 122.328 |
| 1148.0 | 122.378 |
| 1149.0 | 122.427 |
| 1150.0 | 122.477 |
| 1151.0 | 122.527 |
| 1152.0 | 122.577 |
| 1153.0 | 122.627 |
| 1154.0 | 122.678 |
| 1155.0 | 122.728 |
| 1156.0 | 122.779 |
| 1157.0 | 122.83 |
| 1158.0 | 122.881 |
| 1159.0 | 122.932 |
| 1160.0 | 122.983 |
| 1161.0 | 123.035 |
| 1162.0 | 123.086 |
| 1163.0 | 123.138 |
| 1164.0 | 123.19 |
| 1165.0 | 123.242 |
| 1166.0 | 123.294 |
| 1167.0 | 123.346 |
| 1168.0 | 123.399 |
| 1169.0 | 123.451 |
| 1170.0 | 123.504 |
| 1171.0 | 123.557 |
| 1172.0 | 123.61 |
| 1173.0 | 123.663 |
| 1174.0 | 123.716 |
| 1175.0 | 123.769 |
| 1176.0 | 123.823 |
| 1177.0 | 123.876 |
| 1178.0 | 123.93 |
| 1179.0 | 123.984 |
| 1180.0 | 124.038 |
| 1181.0 | 124.092 |
| 1182.0 | 124.147 |
| 1183.0 | 124.201 |
| 1184.0 | 124.256 |
| 1185.0 | 124.311 |
| 1186.0 | 124.366 |
| 1187.0 | 124.421 |
| 1188.0 | 124.476 |
| 1189.0 | 124.531 |
| 1190.0 | 124.586 |
| 1191.0 | 124.642 |
| 1192.0 | 124.698 |
| 1193.0 | 124.754 |
| 1194.0 | 124.81 |
| 1195.0 | 124.866 |
| 1196.0 | 124.922 |
| 1197.0 | 124.978 |
| 1198.0 | 125.035 |
| 1199.0 | 125.091 |
| 1200.0 | 125.148 |
| 1201.0 | 125.205 |
| 1202.0 | 125.262 |
| 1203.0 | 125.319 |
| 1204.0 | 125.377 |
| 1205.0 | 125.434 |
| 1206.0 | 125.492 |
| 1207.0 | 125.549 |
| 1208.0 | 125.607 |
| 1209.0 | 125.665 |
| 1210.0 | 125.723 |
| 1211.0 | 125.781 |
| 1212.0 | 125.84 |
| 1213.0 | 125.898 |
| 1214.0 | 125.957 |
| 1215.0 | 126.016 |
| 1216.0 | 126.074 |
| 1217.0 | 126.133 |
| 1218.0 | 126.193 |
| 1219.0 | 126.252 |
| 1220.0 | 126.311 |
| 1221.0 | 126.371 |
| 1222.0 | 126.43 |
| 1223.0 | 126.49 |
| 1224.0 | 126.55 |
| 1225.0 | 126.61 |
| 1226.0 | 126.67 |
| 1227.0 | 126.73 |
| 1228.0 | 126.791 |
| 1229.0 | 126.851 |
| 1230.0 | 126.912 |
| 1231.0 | 126.973 |
| 1232.0 | 127.033 |
| 1233.0 | 127.094 |
| 1234.0 | 127.156 |
| 1235.0 | 127.217 |
| 1236.0 | 127.278 |
| 1237.0 | 127.34 |
| 1238.0 | 127.401 |
| 1239.0 | 127.463 |
| 1240.0 | 127.525 |
| 1241.0 | 127.587 |
| 1242.0 | 127.649 |
| 1243.0 | 127.711 |
| 1244.0 | 127.774 |
| 1245.0 | 127.836 |
| 1246.0 | 127.899 |
| 1247.0 | 127.961 |
| 1248.0 | 128.024 |
| 1249.0 | 128.087 |
| 1250.0 | 128.15 |
| 1251.0 | 128.214 |
| 1252.0 | 128.277 |
| 1253.0 | 128.34 |
| 1254.0 | 128.404 |
| 1255.0 | 128.468 |
| 1256.0 | 128.531 |
| 1257.0 | 128.595 |
| 1258.0 | 128.659 |
| 1259.0 | 128.724 |
| 1260.0 | 128.788 |
| 1261.0 | 128.852 |
| 1262.0 | 128.917 |
| 1263.0 | 128.981 |
| 1264.0 | 129.046 |
| 1265.0 | 129.111 |
| 1266.0 | 129.176 |
| 1267.0 | 129.241 |
| 1268.0 | 129.306 |
| 1269.0 | 129.372 |
| 1270.0 | 129.437 |
| 1271.0 | 129.503 |
| 1272.0 | 129.568 |
| 1273.0 | 129.634 |
| 1274.0 | 129.7 |
| 1275.0 | 129.766 |
| 1276.0 | 129.832 |
| 1277.0 | 129.899 |
| 1278.0 | 129.965 |
| 1279.0 | 130.031 |
| 1280.0 | 130.098 |
| 1281.0 | 130.165 |
| 1282.0 | 130.232 |
| 1283.0 | 130.299 |
| 1284.0 | 130.366 |
| 1285.0 | 130.433 |
| 1286.0 | 130.5 |
| 1287.0 | 130.568 |
| 1288.0 | 130.635 |
| 1289.0 | 130.703 |
| 1290.0 | 130.77 |
| 1291.0 | 130.838 |
| 1292.0 | 130.906 |
| 1293.0 | 130.974 |
| 1294.0 | 131.042 |
| 1295.0 | 131.111 |
| 1296.0 | 131.179 |
| 1297.0 | 131.248 |
| 1298.0 | 131.316 |
| 1299.0 | 131.385 |
| 1300.0 | 131.454 |
| 1301.0 | 131.523 |
| 1302.0 | 131.592 |
| 1303.0 | 131.661 |
| 1304.0 | 131.73 |
| 1305.0 | 131.8 |
| 1306.0 | 131.869 |
| 1307.0 | 131.939 |
| 1308.0 | 132.009 |
| 1309.0 | 132.079 |
| 1310.0 | 132.148 |
| 1311.0 | 132.219 |
| 1312.0 | 132.289 |
| 1313.0 | 132.359 |
| 1314.0 | 132.429 |
| 1315.0 | 132.5 |
| 1316.0 | 132.57 |
| 1317.0 | 132.641 |
| 1318.0 | 132.712 |
| 1319.0 | 132.783 |
| 1320.0 | 132.854 |
| 1321.0 | 132.925 |
| 1322.0 | 132.996 |
| 1323.0 | 133.067 |
| 1324.0 | 133.139 |
| 1325.0 | 133.21 |
| 1326.0 | 133.282 |
| 1327.0 | 133.354 |
| 1328.0 | 133.426 |
| 1329.0 | 133.498 |
| 1330.0 | 133.57 |
| 1331.0 | 133.642 |
| 1332.0 | 133.714 |
| 1333.0 | 133.787 |
| 1334.0 | 133.859 |
| 1335.0 | 133.932 |
| 1336.0 | 134.004 |
| 1337.0 | 134.077 |
| 1338.0 | 134.15 |
| 1339.0 | 134.223 |
| 1340.0 | 134.296 |
| 1341.0 | 134.369 |
| 1342.0 | 134.443 |
| 1343.0 | 134.516 |
| 1344.0 | 134.59 |
| 1345.0 | 134.663 |
| 1346.0 | 134.737 |
| 1347.0 | 134.811 |
| 1348.0 | 134.885 |
| 1349.0 | 134.959 |
| 1350.0 | 135.033 |
| 1351.0 | 135.107 |
| 1352.0 | 135.181 |
| 1353.0 | 135.256 |
| 1354.0 | 135.33 |
| 1355.0 | 135.405 |
| 1356.0 | 135.48 |
| 1357.0 | 135.555 |
| 1358.0 | 135.629 |
| 1359.0 | 135.705 |
| 1360.0 | 135.78 |
| 1361.0 | 135.855 |
| 1362.0 | 135.93 |
| 1363.0 | 136.006 |
| 1364.0 | 136.081 |
| 1365.0 | 136.157 |
| 1366.0 | 136.232 |
| 1367.0 | 136.308 |
| 1368.0 | 136.384 |
| 1369.0 | 136.46 |
| 1370.0 | 136.536 |
| 1371.0 | 136.613 |
| 1372.0 | 136.689 |
| 1373.0 | 136.765 |
| 1374.0 | 136.842 |
| 1375.0 | 136.918 |
| 1376.0 | 136.995 |
| 1377.0 | 137.072 |
| 1378.0 | 137.149 |
| 1379.0 | 137.226 |
| 1380.0 | 137.303 |
| 1381.0 | 137.38 |
| 1382.0 | 137.457 |
| 1383.0 | 137.535 |
| 1384.0 | 137.612 |
| 1385.0 | 137.69 |
| 1386.0 | 137.767 |
| 1387.0 | 137.845 |
| 1388.0 | 137.923 |
| 1389.0 | 138.001 |
| 1390.0 | 138.079 |
| 1391.0 | 138.157 |
| 1392.0 | 138.235 |
| 1393.0 | 138.313 |
| 1394.0 | 138.392 |
| 1395.0 | 138.47 |
| 1396.0 | 138.549 |
| 1397.0 | 138.628 |
| 1398.0 | 138.706 |
| 1399.0 | 138.785 |
| 1400.0 | 138.864 |
| 1401.0 | 138.943 |
| 1402.0 | 139.023 |
| 1403.0 | 139.102 |
| 1404.0 | 139.181 |
| 1405.0 | 139.261 |
| 1406.0 | 139.34 |
| 1407.0 | 139.42 |
| 1408.0 | 139.499 |
| 1409.0 | 139.579 |
| 1410.0 | 139.659 |
| 1411.0 | 139.739 |
| 1412.0 | 139.819 |
| 1413.0 | 139.899 |
| 1414.0 | 139.98 |
| 1415.0 | 140.06 |
| 1416.0 | 140.14 |
| 1417.0 | 140.221 |
| 1418.0 | 140.301 |
| 1419.0 | 140.382 |
| 1420.0 | 140.463 |
| 1421.0 | 140.544 |
| 1422.0 | 140.625 |
| 1423.0 | 140.706 |
| 1424.0 | 140.787 |
| 1425.0 | 140.868 |
| 1426.0 | 140.95 |
| 1427.0 | 141.031 |
| 1428.0 | 141.113 |
| 1429.0 | 141.194 |
| 1430.0 | 141.276 |
| 1431.0 | 141.358 |
| 1432.0 | 141.44 |
| 1433.0 | 141.521 |
| 1434.0 | 141.604 |
| 1435.0 | 141.686 |
| 1436.0 | 141.768 |
| 1437.0 | 141.85 |
| 1438.0 | 141.933 |
| 1439.0 | 142.015 |
| 1440.0 | 142.098 |
| 1441.0 | 142.18 |
| 1442.0 | 142.263 |
| 1443.0 | 142.346 |
| 1444.0 | 142.429 |
| 1445.0 | 142.512 |
| 1446.0 | 142.595 |
| 1447.0 | 142.678 |
| 1448.0 | 142.761 |
| 1449.0 | 142.845 |
| 1450.0 | 142.928 |
| 1451.0 | 143.012 |
| 1452.0 | 143.095 |
| 1453.0 | 143.179 |
| 1454.0 | 143.263 |
| 1455.0 | 143.346 |
| 1456.0 | 143.43 |
| 1457.0 | 143.514 |
| 1458.0 | 143.599 |
| 1459.0 | 143.683 |
| 1460.0 | 143.767 |
| 1461.0 | 143.851 |
| 1462.0 | 143.936 |
| 1463.0 | 144.02 |
| 1464.0 | 144.105 |
| 1465.0 | 144.19 |
| 1466.0 | 144.274 |
| 1467.0 | 144.359 |
| 1468.0 | 144.444 |
| 1469.0 | 144.529 |
| 1470.0 | 144.614 |
| 1471.0 | 144.7 |
| 1472.0 | 144.785 |
| 1473.0 | 144.87 |
| 1474.0 | 144.956 |
| 1475.0 | 145.041 |
| 1476.0 | 145.127 |
| 1477.0 | 145.213 |
| 1478.0 | 145.298 |
| 1479.0 | 145.384 |
| 1480.0 | 145.47 |
| 1481.0 | 145.556 |
| 1482.0 | 145.642 |
| 1483.0 | 145.728 |
| 1484.0 | 145.815 |
| 1485.0 | 145.901 |
| 1486.0 | 145.987 |
| 1487.0 | 146.074 |
| 1488.0 | 146.161 |
| 1489.0 | 146.247 |
| 1490.0 | 146.334 |
| 1491.0 | 146.421 |
| 1492.0 | 146.508 |
| 1493.0 | 146.595 |
| 1494.0 | 146.682 |
| 1495.0 | 146.769 |
| 1496.0 | 146.856 |
| 1497.0 | 146.943 |
| 1498.0 | 147.031 |
| 1499.0 | 147.118 |
| 1500.0 | 147.206 |
| 1501.0 | 147.294 |
| 1502.0 | 147.381 |
| 1503.0 | 147.469 |
| 1504.0 | 147.557 |
| 1505.0 | 147.645 |
| 1506.0 | 147.733 |
| 1507.0 | 147.821 |
| 1508.0 | 147.909 |
| 1509.0 | 147.997 |
| 1510.0 | 148.086 |
| 1511.0 | 148.174 |
| 1512.0 | 148.263 |
| 1513.0 | 148.351 |
| 1514.0 | 148.44 |
| 1515.0 | 148.529 |
| 1516.0 | 148.617 |
| 1517.0 | 148.706 |
| 1518.0 | 148.795 |
| 1519.0 | 148.884 |
| 1520.0 | 148.973 |
| 1521.0 | 149.063 |
| 1522.0 | 149.152 |
| 1523.0 | 149.241 |
| 1524.0 | 149.331 |
| 1525.0 | 149.42 |
| 1526.0 | 149.51 |
| 1527.0 | 149.599 |
| 1528.0 | 149.689 |
| 1529.0 | 149.779 |
| 1530.0 | 149.869 |
| 1531.0 | 149.959 |
| 1532.0 | 150.049 |
| 1533.0 | 150.139 |
| 1534.0 | 150.229 |
| 1535.0 | 150.319 |
| 1536.0 | 150.409 |
| 1537.0 | 150.5 |
| 1538.0 | 150.59 |
| 1539.0 | 150.681 |
| 1540.0 | 150.771 |
| 1541.0 | 150.862 |
| 1542.0 | 150.953 |
| 1543.0 | 151.044 |
| 1544.0 | 151.135 |
| 1545.0 | 151.226 |
| 1546.0 | 151.317 |
| 1547.0 | 151.408 |
| 1548.0 | 151.499 |
| 1549.0 | 151.59 |
| 1550.0 | 151.682 |
| 1551.0 | 151.773 |
| 1552.0 | 151.865 |
| 1553.0 | 151.956 |
| 1554.0 | 152.048 |
| 1555.0 | 152.14 |
| 1556.0 | 152.231 |
| 1557.0 | 152.323 |
| 1558.0 | 152.415 |
| 1559.0 | 152.507 |
| 1560.0 | 152.599 |
| 1561.0 | 152.692 |
| 1562.0 | 152.784 |
| 1563.0 | 152.876 |
| 1564.0 | 152.968 |
| 1565.0 | 153.061 |
| 1566.0 | 153.153 |
| 1567.0 | 153.246 |
| 1568.0 | 153.339 |
| 1569.0 | 153.431 |
| 1570.0 | 153.524 |
| 1571.0 | 153.617 |
| 1572.0 | 153.71 |
| 1573.0 | 153.803 |
| 1574.0 | 153.896 |
| 1575.0 | 153.989 |
| 1576.0 | 154.083 |
| 1577.0 | 154.176 |
| 1578.0 | 154.269 |
| 1579.0 | 154.363 |
| 1580.0 | 154.456 |
| 1581.0 | 154.55 |
| 1582.0 | 154.643 |
| 1583.0 | 154.737 |
| 1584.0 | 154.831 |
| 1585.0 | 154.925 |
| 1586.0 | 155.019 |
| 1587.0 | 155.113 |
| 1588.0 | 155.207 |
| 1589.0 | 155.301 |
| 1590.0 | 155.395 |
| 1591.0 | 155.489 |
| 1592.0 | 155.584 |
| 1593.0 | 155.678 |
| 1594.0 | 155.773 |
| 1595.0 | 155.867 |
| 1596.0 | 155.962 |
| 1597.0 | 156.056 |
| 1598.0 | 156.151 |
| 1599.0 | 156.246 |
| 1600.0 | 156.341 |
| 1601.0 | 156.436 |
| 1602.0 | 156.531 |
| 1603.0 | 156.626 |
| 1604.0 | 156.721 |
| 1605.0 | 156.816 |
| 1606.0 | 156.912 |
| 1607.0 | 157.007 |
| 1608.0 | 157.103 |
| 1609.0 | 157.198 |
| 1610.0 | 157.294 |
| 1611.0 | 157.389 |
| 1612.0 | 157.485 |
| 1613.0 | 157.581 |
| 1614.0 | 157.677 |
| 1615.0 | 157.772 |
| 1616.0 | 157.868 |
| 1617.0 | 157.964 |
| 1618.0 | 158.061 |
| 1619.0 | 158.157 |
| 1620.0 | 158.253 |
| 1621.0 | 158.349 |
| 1622.0 | 158.446 |
| 1623.0 | 158.542 |
| 1624.0 | 158.639 |
| 1625.0 | 158.735 |
| 1626.0 | 158.832 |
| 1627.0 | 158.928 |
| 1628.0 | 159.025 |
| 1629.0 | 159.122 |
| 1630.0 | 159.219 |
| 1631.0 | 159.316 |
| 1632.0 | 159.413 |
| 1633.0 | 159.51 |
| 1634.0 | 159.607 |
| 1635.0 | 159.704 |
| 1636.0 | 159.802 |
| 1637.0 | 159.899 |
| 1638.0 | 159.996 |
| 1639.0 | 160.094 |
| 1640.0 | 160.191 |
| 1641.0 | 160.289 |
| 1642.0 | 160.387 |
| 1643.0 | 160.484 |
| 1644.0 | 160.582 |
| 1645.0 | 160.68 |
| 1646.0 | 160.778 |
| 1647.0 | 160.876 |
| 1648.0 | 160.974 |
| 1649.0 | 161.072 |
| 1650.0 | 161.17 |
| 1651.0 | 161.269 |
| 1652.0 | 161.367 |
| 1653.0 | 161.465 |
| 1654.0 | 161.564 |
| 1655.0 | 161.662 |
| 1656.0 | 161.761 |
| 1657.0 | 161.859 |
| 1658.0 | 161.958 |
| 1659.0 | 162.057 |
| 1660.0 | 162.156 |
| 1661.0 | 162.254 |
| 1662.0 | 162.353 |
| 1663.0 | 162.452 |
| 1664.0 | 162.551 |
| 1665.0 | 162.65 |
| 1666.0 | 162.75 |
| 1667.0 | 162.849 |
| 1668.0 | 162.948 |
| 1669.0 | 163.048 |
| 1670.0 | 163.147 |
| 1671.0 | 163.246 |
| 1672.0 | 163.346 |
| 1673.0 | 163.446 |
| 1674.0 | 163.545 |
| 1675.0 | 163.645 |
| 1676.0 | 163.745 |
| 1677.0 | 163.845 |
| 1678.0 | 163.945 |
| 1679.0 | 164.044 |
| 1680.0 | 164.145 |
| 1681.0 | 164.245 |
| 1682.0 | 164.345 |
| 1683.0 | 164.445 |
| 1684.0 | 164.545 |
| 1685.0 | 164.646 |
| 1686.0 | 164.746 |
| 1687.0 | 164.846 |
| 1688.0 | 164.947 |
| 1689.0 | 165.048 |
| 1690.0 | 165.148 |
| 1691.0 | 165.249 |
| 1692.0 | 165.35 |
| 1693.0 | 165.45 |
| 1694.0 | 165.551 |
| 1695.0 | 165.652 |
| 1696.0 | 165.753 |
| 1697.0 | 165.854 |
| 1698.0 | 165.955 |
| 1699.0 | 166.057 |
| 1700.0 | 166.158 |
| 1701.0 | 166.259 |
| 1702.0 | 166.36 |
| 1703.0 | 166.462 |
| 1704.0 | 166.563 |
| 1705.0 | 166.665 |
| 1706.0 | 166.766 |
| 1707.0 | 166.868 |
| 1708.0 | 166.97 |
| 1709.0 | 167.071 |
| 1710.0 | 167.173 |
| 1711.0 | 167.275 |
| 1712.0 | 167.377 |
| 1713.0 | 167.479 |
| 1714.0 | 167.581 |
| 1715.0 | 167.683 |
| 1716.0 | 167.785 |
| 1717.0 | 167.888 |
| 1718.0 | 167.99 |
| 1719.0 | 168.092 |
| 1720.0 | 168.195 |
| 1721.0 | 168.297 |
| 1722.0 | 168.399 |
| 1723.0 | 168.502 |
| 1724.0 | 168.605 |
| 1725.0 | 168.707 |
| 1726.0 | 168.81 |
| 1727.0 | 168.913 |
| 1728.0 | 169.016 |
| 1729.0 | 169.119 |
| 1730.0 | 169.222 |
| 1731.0 | 169.325 |
| 1732.0 | 169.428 |
| 1733.0 | 169.531 |
| 1734.0 | 169.634 |
| 1735.0 | 169.737 |
| 1736.0 | 169.84 |
| 1737.0 | 169.944 |
| 1738.0 | 170.047 |
| 1739.0 | 170.151 |
| 1740.0 | 170.254 |
| 1741.0 | 170.358 |
| 1742.0 | 170.461 |
| 1743.0 | 170.565 |
| 1744.0 | 170.669 |
| 1745.0 | 170.773 |
| 1746.0 | 170.876 |
| 1747.0 | 170.98 |
| 1748.0 | 171.084 |
| 1749.0 | 171.188 |
| 1750.0 | 171.292 |
| 1751.0 | 171.397 |
| 1752.0 | 171.501 |
| 1753.0 | 171.605 |
| 1754.0 | 171.709 |
| 1755.0 | 171.814 |
| 1756.0 | 171.918 |
| 1757.0 | 172.022 |
| 1758.0 | 172.127 |
| 1759.0 | 172.231 |
| 1760.0 | 172.336 |
| 1761.0 | 172.441 |
| 1762.0 | 172.545 |
| 1763.0 | 172.65 |
| 1764.0 | 172.755 |
| 1765.0 | 172.86 |
| 1766.0 | 172.965 |
| 1767.0 | 173.07 |
| 1768.0 | 173.175 |
| 1769.0 | 173.28 |
| 1770.0 | 173.385 |
| 1771.0 | 173.49 |
| 1772.0 | 173.596 |
| 1773.0 | 173.701 |
| 1774.0 | 173.806 |
| 1775.0 | 173.912 |
| 1776.0 | 174.017 |
| 1777.0 | 174.123 |
| 1778.0 | 174.228 |
| 1779.0 | 174.334 |
| 1780.0 | 174.44 |
| 1781.0 | 174.545 |
| 1782.0 | 174.651 |
| 1783.0 | 174.757 |
| 1784.0 | 174.863 |
| 1785.0 | 174.969 |
| 1786.0 | 175.075 |
| 1787.0 | 175.181 |
| 1788.0 | 175.287 |
| 1789.0 | 175.393 |
| 1790.0 | 175.499 |
| 1791.0 | 175.605 |
| 1792.0 | 175.712 |
| 1793.0 | 175.818 |
| 1794.0 | 175.925 |
| 1795.0 | 176.031 |
| 1796.0 | 176.138 |
| 1797.0 | 176.244 |
| 1798.0 | 176.351 |
| 1799.0 | 176.457 |
| 1800.0 | 176.564 |
| 1801.0 | 176.671 |
| 1802.0 | 176.778 |
| 1803.0 | 176.885 |
| 1804.0 | 176.991 |
| 1805.0 | 177.098 |
| 1806.0 | 177.205 |
| 1807.0 | 177.313 |
| 1808.0 | 177.42 |
| 1809.0 | 177.527 |
| 1810.0 | 177.634 |
| 1811.0 | 177.741 |
| 1812.0 | 177.849 |
| 1813.0 | 177.956 |
| 1814.0 | 178.063 |
| 1815.0 | 178.171 |
| 1816.0 | 178.278 |
| 1817.0 | 178.386 |
| 1818.0 | 178.494 |
| 1819.0 | 178.601 |
| 1820.0 | 178.709 |
| 1821.0 | 178.817 |
| 1822.0 | 178.925 |
| 1823.0 | 179.033 |
| 1824.0 | 179.14 |
| 1825.0 | 179.248 |
| 1826.0 | 179.356 |
| 1827.0 | 179.465 |
| 1828.0 | 179.573 |
| 1829.0 | 179.681 |
| 1830.0 | 179.789 |
| 1831.0 | 179.897 |
| 1832.0 | 180.006 |
| 1833.0 | 180.114 |
| 1834.0 | 180.222 |
| 1835.0 | 180.331 |
| 1836.0 | 180.439 |
| 1837.0 | 180.548 |
| 1838.0 | 180.657 |
| 1839.0 | 180.765 |
| 1840.0 | 180.874 |
| 1841.0 | 180.983 |
| 1842.0 | 181.091 |
| 1843.0 | 181.2 |
| 1844.0 | 181.309 |
| 1845.0 | 181.418 |
| 1846.0 | 181.527 |
| 1847.0 | 181.636 |
| 1848.0 | 181.745 |
| 1849.0 | 181.854 |
| 1850.0 | 181.964 |
| 1851.0 | 182.073 |
| 1852.0 | 182.182 |
| 1853.0 | 182.292 |
| 1854.0 | 182.401 |
| 1855.0 | 182.51 |
| 1856.0 | 182.62 |
| 1857.0 | 182.729 |
| 1858.0 | 182.839 |
| 1859.0 | 182.948 |
| 1860.0 | 183.058 |
| 1861.0 | 183.168 |
| 1862.0 | 183.278 |
| 1863.0 | 183.387 |
| 1864.0 | 183.497 |
| 1865.0 | 183.607 |
| 1866.0 | 183.717 |
| 1867.0 | 183.827 |
| 1868.0 | 183.937 |
| 1869.0 | 184.047 |
| 1870.0 | 184.157 |
| 1871.0 | 184.268 |
| 1872.0 | 184.378 |
| 1873.0 | 184.488 |
| 1874.0 | 184.598 |
| 1875.0 | 184.709 |
| 1876.0 | 184.819 |
| 1877.0 | 184.93 |
| 1878.0 | 185.04 |
| 1879.0 | 185.151 |
| 1880.0 | 185.261 |
| 1881.0 | 185.372 |
| 1882.0 | 185.483 |
| 1883.0 | 185.593 |
| 1884.0 | 185.704 |
| 1885.0 | 185.815 |
| 1886.0 | 185.926 |
| 1887.0 | 186.037 |
| 1888.0 | 186.148 |
| 1889.0 | 186.259 |
| 1890.0 | 186.37 |
| 1891.0 | 186.481 |
| 1892.0 | 186.592 |
| 1893.0 | 186.703 |
| 1894.0 | 186.814 |
| 1895.0 | 186.926 |
| 1896.0 | 187.037 |
| 1897.0 | 187.148 |
| 1898.0 | 187.26 |
| 1899.0 | 187.371 |
| 1900.0 | 187.483 |
| 1901.0 | 187.594 |
| 1902.0 | 187.706 |
| 1903.0 | 187.817 |
| 1904.0 | 187.929 |
| 1905.0 | 188.041 |
| 1906.0 | 188.152 |
| 1907.0 | 188.264 |
| 1908.0 | 188.376 |
| 1909.0 | 188.488 |
| 1910.0 | 188.6 |
| 1911.0 | 188.712 |
| 1912.0 | 188.824 |
| 1913.0 | 188.936 |
| 1914.0 | 189.048 |
| 1915.0 | 189.16 |
| 1916.0 | 189.272 |
| 1917.0 | 189.385 |
| 1918.0 | 189.497 |
| 1919.0 | 189.609 |
| 1920.0 | 189.722 |
| 1921.0 | 189.834 |
| 1922.0 | 189.947 |
| 1923.0 | 190.059 |
| 1924.0 | 190.172 |
| 1925.0 | 190.284 |
| 1926.0 | 190.397 |
| 1927.0 | 190.51 |
| 1928.0 | 190.622 |
| 1929.0 | 190.735 |
| 1930.0 | 190.848 |
| 1931.0 | 190.961 |
| 1932.0 | 191.074 |
| 1933.0 | 191.187 |
| 1934.0 | 191.3 |
| 1935.0 | 191.413 |
| 1936.0 | 191.526 |
| 1937.0 | 191.639 |
| 1938.0 | 191.752 |
| 1939.0 | 191.865 |
| 1940.0 | 191.978 |
| 1941.0 | 192.092 |
| 1942.0 | 192.205 |
| 1943.0 | 192.318 |
| 1944.0 | 192.432 |
| 1945.0 | 192.545 |
| 1946.0 | 192.659 |
| 1947.0 | 192.772 |
| 1948.0 | 192.886 |
| 1949.0 | 192.999 |
| 1950.0 | 193.113 |
| 1951.0 | 193.227 |
| 1952.0 | 193.34 |
| 1953.0 | 193.454 |
| 1954.0 | 193.568 |
| 1955.0 | 193.682 |
| 1956.0 | 193.796 |
| 1957.0 | 193.91 |
| 1958.0 | 194.024 |
| 1959.0 | 194.138 |
| 1960.0 | 194.252 |
| 1961.0 | 194.366 |
| 1962.0 | 194.48 |
| 1963.0 | 194.594 |
| 1964.0 | 194.708 |
| 1965.0 | 194.823 |
| 1966.0 | 194.937 |
| 1967.0 | 195.051 |
| 1968.0 | 195.166 |
| 1969.0 | 195.28 |
| 1970.0 | 195.395 |
| 1971.0 | 195.509 |
| 1972.0 | 195.624 |
| 1973.0 | 195.738 |
| 1974.0 | 195.853 |
| 1975.0 | 195.968 |
| 1976.0 | 196.082 |
| 1977.0 | 196.197 |
| 1978.0 | 196.312 |
| 1979.0 | 196.427 |
| 1980.0 | 196.542 |
| 1981.0 | 196.656 |
| 1982.0 | 196.771 |
| 1983.0 | 196.886 |
| 1984.0 | 197.001 |
| 1985.0 | 197.116 |
| 1986.0 | 197.232 |
| 1987.0 | 197.347 |
| 1988.0 | 197.462 |
| 1989.0 | 197.577 |
| 1990.0 | 197.692 |
| 1991.0 | 197.808 |
| 1992.0 | 197.923 |
| 1993.0 | 198.039 |
| 1994.0 | 198.154 |
| 1995.0 | 198.269 |
| 1996.0 | 198.385 |
| 1997.0 | 198.5 |
| 1998.0 | 198.616 |
| 1999.0 | 198.732 |
| 2000.0 | 198.847 |